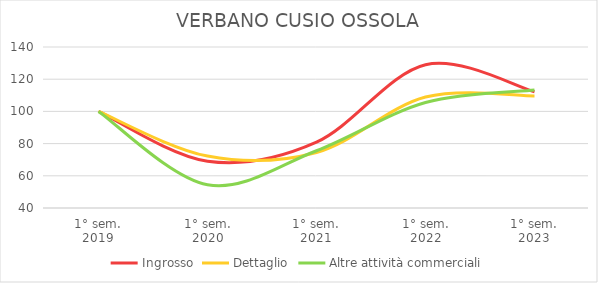
| Category | Ingrosso | Dettaglio | Altre attività commerciali |
|---|---|---|---|
| 1° sem.
2019 | 100 | 100 | 100 |
| 1° sem.
2020 | 69.084 | 72.244 | 54.444 |
| 1° sem.
2021 | 80.916 | 74.502 | 75.556 |
| 1° sem.
2022 | 129.008 | 108.898 | 105.556 |
| 1° sem.
2023 | 112.214 | 109.562 | 113.333 |